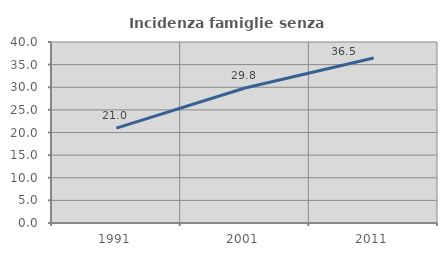
| Category | Incidenza famiglie senza nuclei |
|---|---|
| 1991.0 | 20.953 |
| 2001.0 | 29.83 |
| 2011.0 | 36.456 |